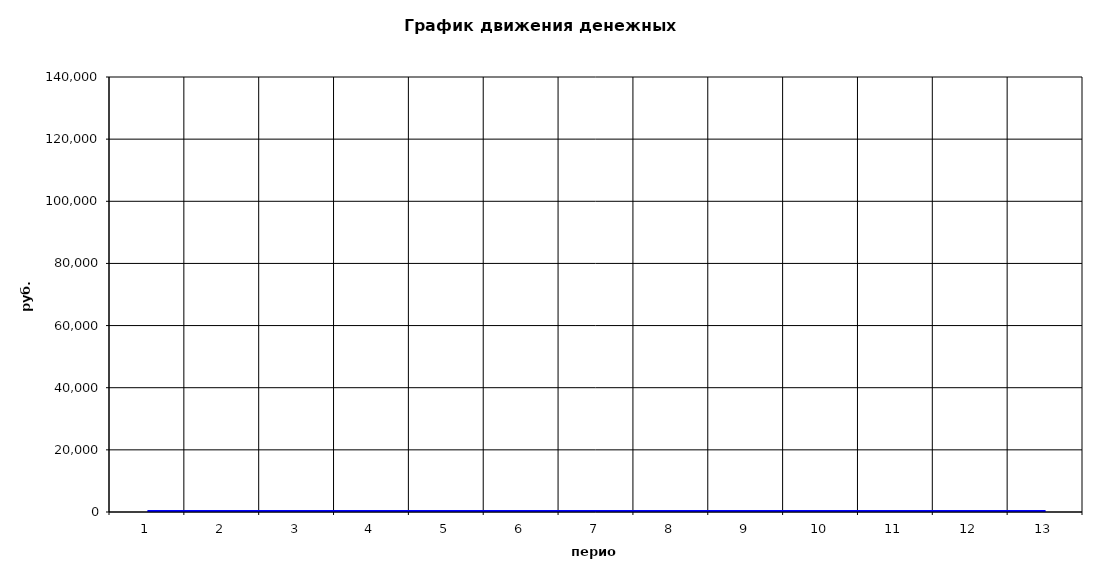
| Category | Series 0 | Series 1 |
|---|---|---|
| 0 | 0 | 0 |
| 1 | 1 | 0 |
| 2 | 2 | 0 |
| 3 | 3 | 0 |
| 4 | 4 | 0 |
| 5 | 5 | 0 |
| 6 | 6 | 0 |
| 7 | 7 | 0 |
| 8 | 8 | 0 |
| 9 | 9 | 0 |
| 10 | 10 | 0 |
| 11 | 11 | 0 |
| 12 | 12 | 0 |